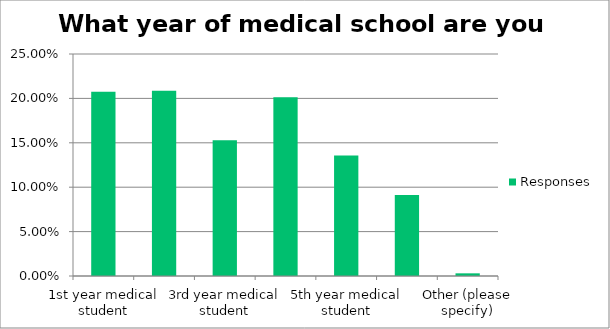
| Category | Responses |
|---|---|
| 1st year medical student | 0.208 |
| 2nd year medical student | 0.208 |
| 3rd year medical student | 0.153 |
| 4th year medical student | 0.201 |
| 5th year medical student | 0.136 |
| 6th year medical student | 0.091 |
| Other (please specify) | 0.003 |